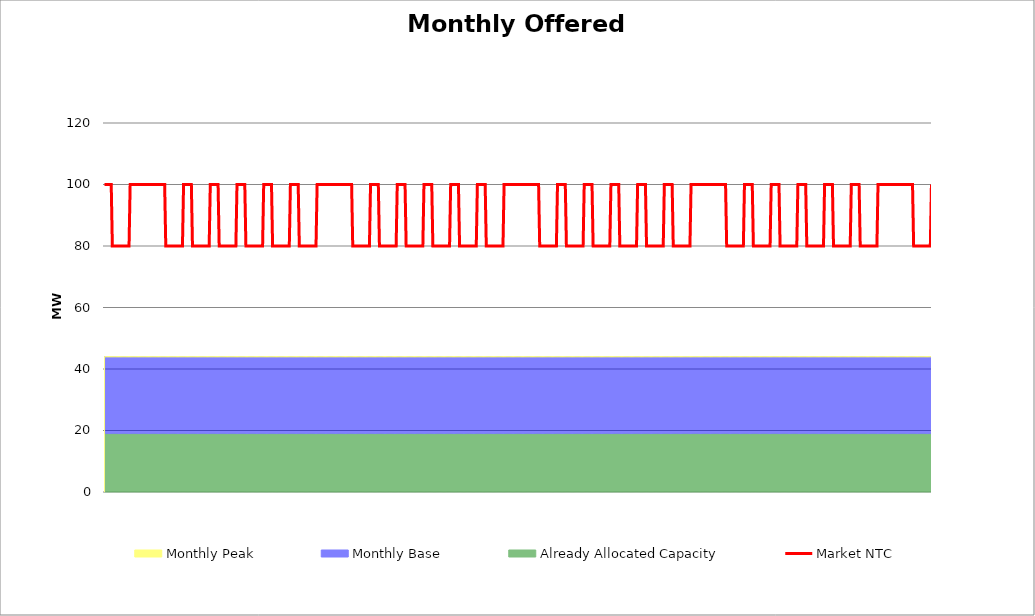
| Category | Market NTC |
|---|---|
| 0 | 100 |
| 1 | 100 |
| 2 | 100 |
| 3 | 100 |
| 4 | 100 |
| 5 | 100 |
| 6 | 100 |
| 7 | 80 |
| 8 | 80 |
| 9 | 80 |
| 10 | 80 |
| 11 | 80 |
| 12 | 80 |
| 13 | 80 |
| 14 | 80 |
| 15 | 80 |
| 16 | 80 |
| 17 | 80 |
| 18 | 80 |
| 19 | 80 |
| 20 | 80 |
| 21 | 80 |
| 22 | 80 |
| 23 | 100 |
| 24 | 100 |
| 25 | 100 |
| 26 | 100 |
| 27 | 100 |
| 28 | 100 |
| 29 | 100 |
| 30 | 100 |
| 31 | 100 |
| 32 | 100 |
| 33 | 100 |
| 34 | 100 |
| 35 | 100 |
| 36 | 100 |
| 37 | 100 |
| 38 | 100 |
| 39 | 100 |
| 40 | 100 |
| 41 | 100 |
| 42 | 100 |
| 43 | 100 |
| 44 | 100 |
| 45 | 100 |
| 46 | 100 |
| 47 | 100 |
| 48 | 100 |
| 49 | 100 |
| 50 | 100 |
| 51 | 100 |
| 52 | 100 |
| 53 | 100 |
| 54 | 100 |
| 55 | 80 |
| 56 | 80 |
| 57 | 80 |
| 58 | 80 |
| 59 | 80 |
| 60 | 80 |
| 61 | 80 |
| 62 | 80 |
| 63 | 80 |
| 64 | 80 |
| 65 | 80 |
| 66 | 80 |
| 67 | 80 |
| 68 | 80 |
| 69 | 80 |
| 70 | 80 |
| 71 | 100 |
| 72 | 100 |
| 73 | 100 |
| 74 | 100 |
| 75 | 100 |
| 76 | 100 |
| 77 | 100 |
| 78 | 100 |
| 79 | 80 |
| 80 | 80 |
| 81 | 80 |
| 82 | 80 |
| 83 | 80 |
| 84 | 80 |
| 85 | 80 |
| 86 | 80 |
| 87 | 80 |
| 88 | 80 |
| 89 | 80 |
| 90 | 80 |
| 91 | 80 |
| 92 | 80 |
| 93 | 80 |
| 94 | 80 |
| 95 | 100 |
| 96 | 100 |
| 97 | 100 |
| 98 | 100 |
| 99 | 100 |
| 100 | 100 |
| 101 | 100 |
| 102 | 100 |
| 103 | 80 |
| 104 | 80 |
| 105 | 80 |
| 106 | 80 |
| 107 | 80 |
| 108 | 80 |
| 109 | 80 |
| 110 | 80 |
| 111 | 80 |
| 112 | 80 |
| 113 | 80 |
| 114 | 80 |
| 115 | 80 |
| 116 | 80 |
| 117 | 80 |
| 118 | 80 |
| 119 | 100 |
| 120 | 100 |
| 121 | 100 |
| 122 | 100 |
| 123 | 100 |
| 124 | 100 |
| 125 | 100 |
| 126 | 100 |
| 127 | 80 |
| 128 | 80 |
| 129 | 80 |
| 130 | 80 |
| 131 | 80 |
| 132 | 80 |
| 133 | 80 |
| 134 | 80 |
| 135 | 80 |
| 136 | 80 |
| 137 | 80 |
| 138 | 80 |
| 139 | 80 |
| 140 | 80 |
| 141 | 80 |
| 142 | 80 |
| 143 | 100 |
| 144 | 100 |
| 145 | 100 |
| 146 | 100 |
| 147 | 100 |
| 148 | 100 |
| 149 | 100 |
| 150 | 100 |
| 151 | 80 |
| 152 | 80 |
| 153 | 80 |
| 154 | 80 |
| 155 | 80 |
| 156 | 80 |
| 157 | 80 |
| 158 | 80 |
| 159 | 80 |
| 160 | 80 |
| 161 | 80 |
| 162 | 80 |
| 163 | 80 |
| 164 | 80 |
| 165 | 80 |
| 166 | 80 |
| 167 | 100 |
| 168 | 100 |
| 169 | 100 |
| 170 | 100 |
| 171 | 100 |
| 172 | 100 |
| 173 | 100 |
| 174 | 100 |
| 175 | 80 |
| 176 | 80 |
| 177 | 80 |
| 178 | 80 |
| 179 | 80 |
| 180 | 80 |
| 181 | 80 |
| 182 | 80 |
| 183 | 80 |
| 184 | 80 |
| 185 | 80 |
| 186 | 80 |
| 187 | 80 |
| 188 | 80 |
| 189 | 80 |
| 190 | 80 |
| 191 | 100 |
| 192 | 100 |
| 193 | 100 |
| 194 | 100 |
| 195 | 100 |
| 196 | 100 |
| 197 | 100 |
| 198 | 100 |
| 199 | 100 |
| 200 | 100 |
| 201 | 100 |
| 202 | 100 |
| 203 | 100 |
| 204 | 100 |
| 205 | 100 |
| 206 | 100 |
| 207 | 100 |
| 208 | 100 |
| 209 | 100 |
| 210 | 100 |
| 211 | 100 |
| 212 | 100 |
| 213 | 100 |
| 214 | 100 |
| 215 | 100 |
| 216 | 100 |
| 217 | 100 |
| 218 | 100 |
| 219 | 100 |
| 220 | 100 |
| 221 | 100 |
| 222 | 100 |
| 223 | 80 |
| 224 | 80 |
| 225 | 80 |
| 226 | 80 |
| 227 | 80 |
| 228 | 80 |
| 229 | 80 |
| 230 | 80 |
| 231 | 80 |
| 232 | 80 |
| 233 | 80 |
| 234 | 80 |
| 235 | 80 |
| 236 | 80 |
| 237 | 80 |
| 238 | 80 |
| 239 | 100 |
| 240 | 100 |
| 241 | 100 |
| 242 | 100 |
| 243 | 100 |
| 244 | 100 |
| 245 | 100 |
| 246 | 100 |
| 247 | 80 |
| 248 | 80 |
| 249 | 80 |
| 250 | 80 |
| 251 | 80 |
| 252 | 80 |
| 253 | 80 |
| 254 | 80 |
| 255 | 80 |
| 256 | 80 |
| 257 | 80 |
| 258 | 80 |
| 259 | 80 |
| 260 | 80 |
| 261 | 80 |
| 262 | 80 |
| 263 | 100 |
| 264 | 100 |
| 265 | 100 |
| 266 | 100 |
| 267 | 100 |
| 268 | 100 |
| 269 | 100 |
| 270 | 100 |
| 271 | 80 |
| 272 | 80 |
| 273 | 80 |
| 274 | 80 |
| 275 | 80 |
| 276 | 80 |
| 277 | 80 |
| 278 | 80 |
| 279 | 80 |
| 280 | 80 |
| 281 | 80 |
| 282 | 80 |
| 283 | 80 |
| 284 | 80 |
| 285 | 80 |
| 286 | 80 |
| 287 | 100 |
| 288 | 100 |
| 289 | 100 |
| 290 | 100 |
| 291 | 100 |
| 292 | 100 |
| 293 | 100 |
| 294 | 100 |
| 295 | 80 |
| 296 | 80 |
| 297 | 80 |
| 298 | 80 |
| 299 | 80 |
| 300 | 80 |
| 301 | 80 |
| 302 | 80 |
| 303 | 80 |
| 304 | 80 |
| 305 | 80 |
| 306 | 80 |
| 307 | 80 |
| 308 | 80 |
| 309 | 80 |
| 310 | 80 |
| 311 | 100 |
| 312 | 100 |
| 313 | 100 |
| 314 | 100 |
| 315 | 100 |
| 316 | 100 |
| 317 | 100 |
| 318 | 100 |
| 319 | 80 |
| 320 | 80 |
| 321 | 80 |
| 322 | 80 |
| 323 | 80 |
| 324 | 80 |
| 325 | 80 |
| 326 | 80 |
| 327 | 80 |
| 328 | 80 |
| 329 | 80 |
| 330 | 80 |
| 331 | 80 |
| 332 | 80 |
| 333 | 80 |
| 334 | 80 |
| 335 | 100 |
| 336 | 100 |
| 337 | 100 |
| 338 | 100 |
| 339 | 100 |
| 340 | 100 |
| 341 | 100 |
| 342 | 100 |
| 343 | 80 |
| 344 | 80 |
| 345 | 80 |
| 346 | 80 |
| 347 | 80 |
| 348 | 80 |
| 349 | 80 |
| 350 | 80 |
| 351 | 80 |
| 352 | 80 |
| 353 | 80 |
| 354 | 80 |
| 355 | 80 |
| 356 | 80 |
| 357 | 80 |
| 358 | 80 |
| 359 | 100 |
| 360 | 100 |
| 361 | 100 |
| 362 | 100 |
| 363 | 100 |
| 364 | 100 |
| 365 | 100 |
| 366 | 100 |
| 367 | 100 |
| 368 | 100 |
| 369 | 100 |
| 370 | 100 |
| 371 | 100 |
| 372 | 100 |
| 373 | 100 |
| 374 | 100 |
| 375 | 100 |
| 376 | 100 |
| 377 | 100 |
| 378 | 100 |
| 379 | 100 |
| 380 | 100 |
| 381 | 100 |
| 382 | 100 |
| 383 | 100 |
| 384 | 100 |
| 385 | 100 |
| 386 | 100 |
| 387 | 100 |
| 388 | 100 |
| 389 | 100 |
| 390 | 100 |
| 391 | 80 |
| 392 | 80 |
| 393 | 80 |
| 394 | 80 |
| 395 | 80 |
| 396 | 80 |
| 397 | 80 |
| 398 | 80 |
| 399 | 80 |
| 400 | 80 |
| 401 | 80 |
| 402 | 80 |
| 403 | 80 |
| 404 | 80 |
| 405 | 80 |
| 406 | 80 |
| 407 | 100 |
| 408 | 100 |
| 409 | 100 |
| 410 | 100 |
| 411 | 100 |
| 412 | 100 |
| 413 | 100 |
| 414 | 100 |
| 415 | 80 |
| 416 | 80 |
| 417 | 80 |
| 418 | 80 |
| 419 | 80 |
| 420 | 80 |
| 421 | 80 |
| 422 | 80 |
| 423 | 80 |
| 424 | 80 |
| 425 | 80 |
| 426 | 80 |
| 427 | 80 |
| 428 | 80 |
| 429 | 80 |
| 430 | 80 |
| 431 | 100 |
| 432 | 100 |
| 433 | 100 |
| 434 | 100 |
| 435 | 100 |
| 436 | 100 |
| 437 | 100 |
| 438 | 100 |
| 439 | 80 |
| 440 | 80 |
| 441 | 80 |
| 442 | 80 |
| 443 | 80 |
| 444 | 80 |
| 445 | 80 |
| 446 | 80 |
| 447 | 80 |
| 448 | 80 |
| 449 | 80 |
| 450 | 80 |
| 451 | 80 |
| 452 | 80 |
| 453 | 80 |
| 454 | 80 |
| 455 | 100 |
| 456 | 100 |
| 457 | 100 |
| 458 | 100 |
| 459 | 100 |
| 460 | 100 |
| 461 | 100 |
| 462 | 100 |
| 463 | 80 |
| 464 | 80 |
| 465 | 80 |
| 466 | 80 |
| 467 | 80 |
| 468 | 80 |
| 469 | 80 |
| 470 | 80 |
| 471 | 80 |
| 472 | 80 |
| 473 | 80 |
| 474 | 80 |
| 475 | 80 |
| 476 | 80 |
| 477 | 80 |
| 478 | 80 |
| 479 | 100 |
| 480 | 100 |
| 481 | 100 |
| 482 | 100 |
| 483 | 100 |
| 484 | 100 |
| 485 | 100 |
| 486 | 100 |
| 487 | 80 |
| 488 | 80 |
| 489 | 80 |
| 490 | 80 |
| 491 | 80 |
| 492 | 80 |
| 493 | 80 |
| 494 | 80 |
| 495 | 80 |
| 496 | 80 |
| 497 | 80 |
| 498 | 80 |
| 499 | 80 |
| 500 | 80 |
| 501 | 80 |
| 502 | 80 |
| 503 | 100 |
| 504 | 100 |
| 505 | 100 |
| 506 | 100 |
| 507 | 100 |
| 508 | 100 |
| 509 | 100 |
| 510 | 100 |
| 511 | 80 |
| 512 | 80 |
| 513 | 80 |
| 514 | 80 |
| 515 | 80 |
| 516 | 80 |
| 517 | 80 |
| 518 | 80 |
| 519 | 80 |
| 520 | 80 |
| 521 | 80 |
| 522 | 80 |
| 523 | 80 |
| 524 | 80 |
| 525 | 80 |
| 526 | 80 |
| 527 | 100 |
| 528 | 100 |
| 529 | 100 |
| 530 | 100 |
| 531 | 100 |
| 532 | 100 |
| 533 | 100 |
| 534 | 100 |
| 535 | 100 |
| 536 | 100 |
| 537 | 100 |
| 538 | 100 |
| 539 | 100 |
| 540 | 100 |
| 541 | 100 |
| 542 | 100 |
| 543 | 100 |
| 544 | 100 |
| 545 | 100 |
| 546 | 100 |
| 547 | 100 |
| 548 | 100 |
| 549 | 100 |
| 550 | 100 |
| 551 | 100 |
| 552 | 100 |
| 553 | 100 |
| 554 | 100 |
| 555 | 100 |
| 556 | 100 |
| 557 | 100 |
| 558 | 100 |
| 559 | 80 |
| 560 | 80 |
| 561 | 80 |
| 562 | 80 |
| 563 | 80 |
| 564 | 80 |
| 565 | 80 |
| 566 | 80 |
| 567 | 80 |
| 568 | 80 |
| 569 | 80 |
| 570 | 80 |
| 571 | 80 |
| 572 | 80 |
| 573 | 80 |
| 574 | 80 |
| 575 | 100 |
| 576 | 100 |
| 577 | 100 |
| 578 | 100 |
| 579 | 100 |
| 580 | 100 |
| 581 | 100 |
| 582 | 100 |
| 583 | 80 |
| 584 | 80 |
| 585 | 80 |
| 586 | 80 |
| 587 | 80 |
| 588 | 80 |
| 589 | 80 |
| 590 | 80 |
| 591 | 80 |
| 592 | 80 |
| 593 | 80 |
| 594 | 80 |
| 595 | 80 |
| 596 | 80 |
| 597 | 80 |
| 598 | 80 |
| 599 | 100 |
| 600 | 100 |
| 601 | 100 |
| 602 | 100 |
| 603 | 100 |
| 604 | 100 |
| 605 | 100 |
| 606 | 100 |
| 607 | 80 |
| 608 | 80 |
| 609 | 80 |
| 610 | 80 |
| 611 | 80 |
| 612 | 80 |
| 613 | 80 |
| 614 | 80 |
| 615 | 80 |
| 616 | 80 |
| 617 | 80 |
| 618 | 80 |
| 619 | 80 |
| 620 | 80 |
| 621 | 80 |
| 622 | 80 |
| 623 | 100 |
| 624 | 100 |
| 625 | 100 |
| 626 | 100 |
| 627 | 100 |
| 628 | 100 |
| 629 | 100 |
| 630 | 100 |
| 631 | 80 |
| 632 | 80 |
| 633 | 80 |
| 634 | 80 |
| 635 | 80 |
| 636 | 80 |
| 637 | 80 |
| 638 | 80 |
| 639 | 80 |
| 640 | 80 |
| 641 | 80 |
| 642 | 80 |
| 643 | 80 |
| 644 | 80 |
| 645 | 80 |
| 646 | 80 |
| 647 | 100 |
| 648 | 100 |
| 649 | 100 |
| 650 | 100 |
| 651 | 100 |
| 652 | 100 |
| 653 | 100 |
| 654 | 100 |
| 655 | 80 |
| 656 | 80 |
| 657 | 80 |
| 658 | 80 |
| 659 | 80 |
| 660 | 80 |
| 661 | 80 |
| 662 | 80 |
| 663 | 80 |
| 664 | 80 |
| 665 | 80 |
| 666 | 80 |
| 667 | 80 |
| 668 | 80 |
| 669 | 80 |
| 670 | 80 |
| 671 | 100 |
| 672 | 100 |
| 673 | 100 |
| 674 | 100 |
| 675 | 100 |
| 676 | 100 |
| 677 | 100 |
| 678 | 100 |
| 679 | 80 |
| 680 | 80 |
| 681 | 80 |
| 682 | 80 |
| 683 | 80 |
| 684 | 80 |
| 685 | 80 |
| 686 | 80 |
| 687 | 80 |
| 688 | 80 |
| 689 | 80 |
| 690 | 80 |
| 691 | 80 |
| 692 | 80 |
| 693 | 80 |
| 694 | 80 |
| 695 | 100 |
| 696 | 100 |
| 697 | 100 |
| 698 | 100 |
| 699 | 100 |
| 700 | 100 |
| 701 | 100 |
| 702 | 100 |
| 703 | 100 |
| 704 | 100 |
| 705 | 100 |
| 706 | 100 |
| 707 | 100 |
| 708 | 100 |
| 709 | 100 |
| 710 | 100 |
| 711 | 100 |
| 712 | 100 |
| 713 | 100 |
| 714 | 100 |
| 715 | 100 |
| 716 | 100 |
| 717 | 100 |
| 718 | 100 |
| 719 | 100 |
| 720 | 100 |
| 721 | 100 |
| 722 | 100 |
| 723 | 100 |
| 724 | 100 |
| 725 | 100 |
| 726 | 100 |
| 727 | 80 |
| 728 | 80 |
| 729 | 80 |
| 730 | 80 |
| 731 | 80 |
| 732 | 80 |
| 733 | 80 |
| 734 | 80 |
| 735 | 80 |
| 736 | 80 |
| 737 | 80 |
| 738 | 80 |
| 739 | 80 |
| 740 | 80 |
| 741 | 80 |
| 742 | 80 |
| 743 | 100 |